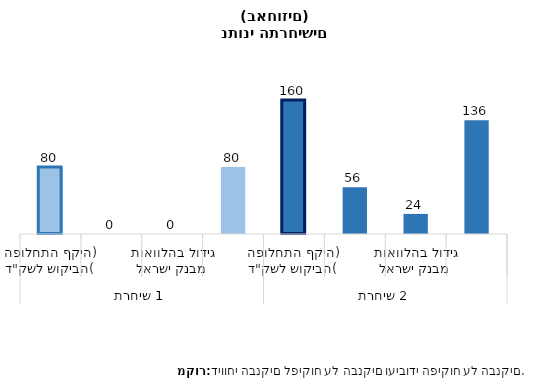
| Category | Series 0 |
|---|---|
| 0 | 80.181 |
| 1 | 0 |
| 2 | 0 |
| 3 | 80.181 |
| 4 | 160.361 |
| 5 | 56.126 |
| 6 | 24.054 |
| 7 | 136.307 |